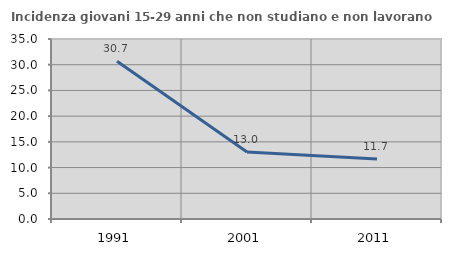
| Category | Incidenza giovani 15-29 anni che non studiano e non lavorano  |
|---|---|
| 1991.0 | 30.693 |
| 2001.0 | 13.014 |
| 2011.0 | 11.667 |